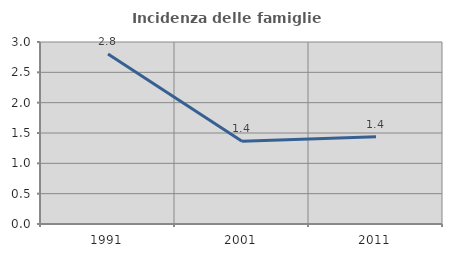
| Category | Incidenza delle famiglie numerose |
|---|---|
| 1991.0 | 2.801 |
| 2001.0 | 1.363 |
| 2011.0 | 1.439 |